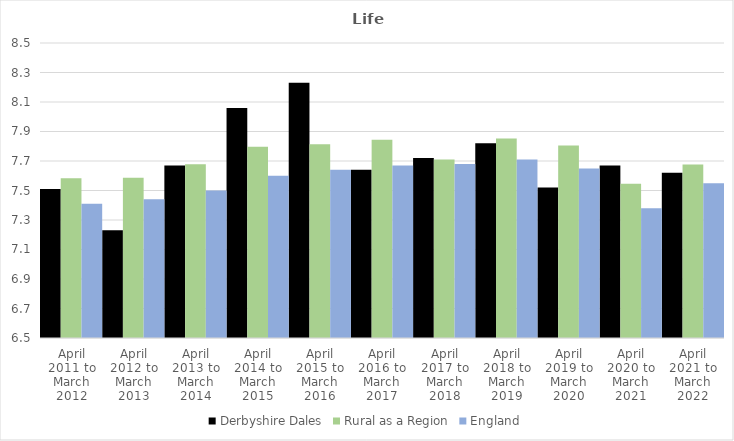
| Category | Derbyshire Dales | Rural as a Region | England |
|---|---|---|---|
| April 2011 to March 2012 | 7.51 | 7.584 | 7.41 |
| April 2012 to March 2013 | 7.23 | 7.586 | 7.44 |
| April 2013 to March 2014 | 7.67 | 7.677 | 7.5 |
| April 2014 to March 2015 | 8.06 | 7.797 | 7.6 |
| April 2015 to March 2016 | 8.23 | 7.813 | 7.64 |
| April 2016 to March 2017 | 7.64 | 7.845 | 7.67 |
| April 2017 to March 2018 | 7.72 | 7.71 | 7.68 |
| April 2018 to March 2019 | 7.82 | 7.852 | 7.71 |
| April 2019 to March 2020 | 7.52 | 7.806 | 7.65 |
| April 2020 to March 2021 | 7.67 | 7.546 | 7.38 |
| April 2021 to March 2022 | 7.62 | 7.677 | 7.55 |